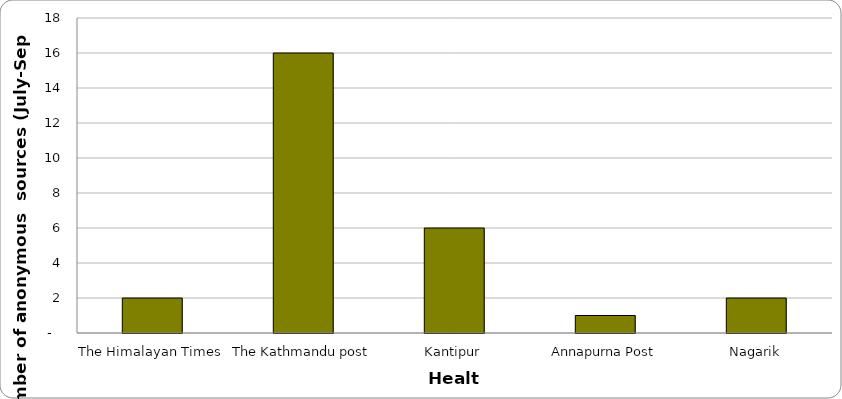
| Category | Health |
|---|---|
| The Himalayan Times | 2 |
| The Kathmandu post | 16 |
| Kantipur | 6 |
| Annapurna Post | 1 |
| Nagarik | 2 |